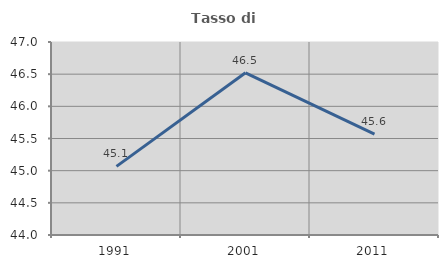
| Category | Tasso di occupazione   |
|---|---|
| 1991.0 | 45.066 |
| 2001.0 | 46.521 |
| 2011.0 | 45.568 |